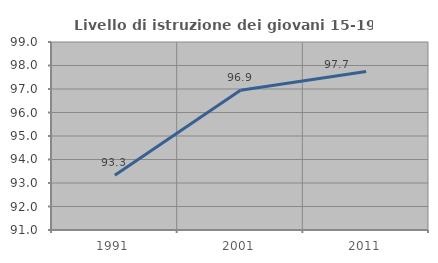
| Category | Livello di istruzione dei giovani 15-19 anni |
|---|---|
| 1991.0 | 93.333 |
| 2001.0 | 96.943 |
| 2011.0 | 97.74 |